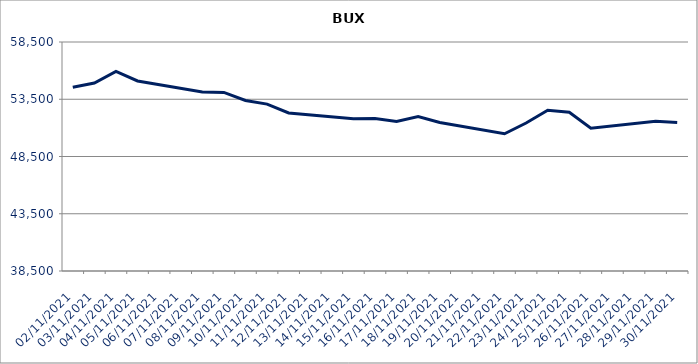
| Category | Series 0 |
|---|---|
| 02/11/2021 | 54548.9 |
| 03/11/2021 | 54914.54 |
| 04/11/2021 | 55925.58 |
| 05/11/2021 | 55099.88 |
| 08/11/2021 | 54132.14 |
| 09/11/2021 | 54099.27 |
| 10/11/2021 | 53389.23 |
| 11/11/2021 | 53073.34 |
| 12/11/2021 | 52306.67 |
| 15/11/2021 | 51789.8 |
| 16/11/2021 | 51818.41 |
| 17/11/2021 | 51549.36 |
| 18/11/2021 | 51992.3 |
| 19/11/2021 | 51472.91 |
| 22/11/2021 | 50483.99 |
| 23/11/2021 | 51424.26 |
| 24/11/2021 | 52535.97 |
| 25/11/2021 | 52364.37 |
| 26/11/2021 | 50961.25 |
| 29/11/2021 | 51579.66 |
| 30/11/2021 | 51464.6 |